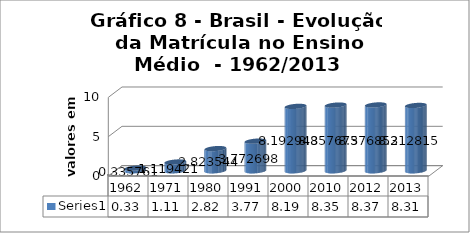
| Category | Series 0 |
|---|---|
| 1962.0 | 0.336 |
| 1971.0 | 1.119 |
| 1980.0 | 2.824 |
| 1991.0 | 3.773 |
| 2000.0 | 8.193 |
| 2010.0 | 8.358 |
| 2012.0 | 8.377 |
| 2013.0 | 8.313 |